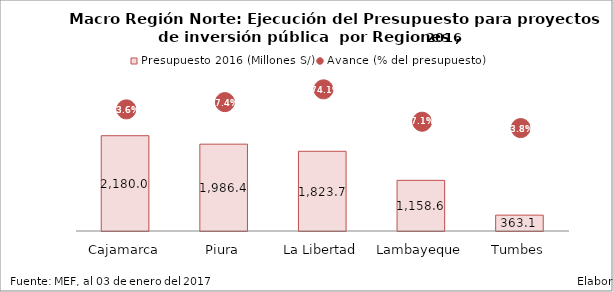
| Category | Presupuesto 2016 (Millones S/) |
|---|---|
| Cajamarca | 2179.984 |
| Piura | 1986.435 |
| La Libertad | 1823.685 |
| Lambayeque | 1158.584 |
| Tumbes | 363.142 |